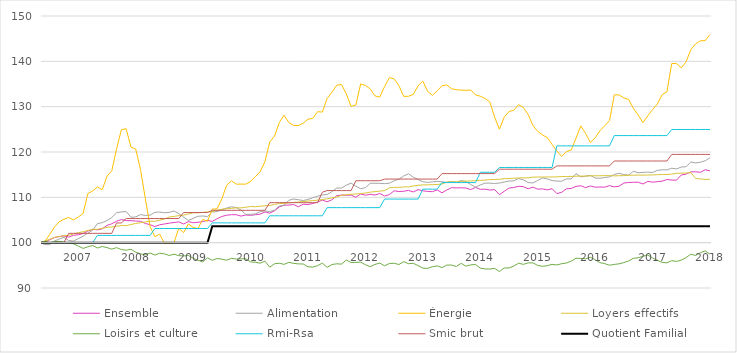
| Category | Ensemble | Alimentation | Énergie | Loyers effectifs  | Loisirs et culture | Rmi-Rsa | Smic brut | Quotient Familial |
|---|---|---|---|---|---|---|---|---|
| 2018.0 | 115.839 | 118.732 | 145.919 | 113.98 | 97.485 | 124.967 | 119.469 | 103.636 |
| 2018.0 | 116.085 | 118.072 | 144.578 | 113.957 | 98.178 | 124.967 | 119.469 | 103.636 |
| 2018.0 | 115.526 | 117.743 | 144.54 | 114.072 | 97.789 | 124.967 | 119.469 | 103.636 |
| 2018.0 | 115.626 | 117.595 | 143.844 | 114.14 | 97.172 | 124.967 | 119.469 | 103.636 |
| 2018.0 | 115.615 | 117.799 | 142.617 | 115.455 | 97.456 | 124.967 | 119.469 | 103.636 |
| 2018.0 | 115.123 | 116.754 | 139.871 | 115.364 | 96.707 | 124.967 | 119.469 | 103.636 |
| 2018.0 | 114.933 | 116.686 | 138.555 | 115.318 | 96.156 | 124.967 | 119.469 | 103.636 |
| 2018.0 | 113.781 | 116.265 | 139.529 | 115.295 | 95.862 | 124.967 | 119.469 | 103.636 |
| 2018.0 | 113.814 | 116.424 | 139.517 | 115.123 | 96.033 | 124.967 | 119.469 | 103.636 |
| 2017.0 | 113.926 | 116.049 | 133.279 | 115.043 | 95.549 | 123.622 | 118.018 | 103.636 |
| 2017.0 | 113.568 | 116.072 | 132.646 | 115.032 | 95.644 | 123.622 | 118.018 | 103.636 |
| 2017.0 | 113.456 | 115.958 | 130.609 | 114.998 | 96.118 | 123.622 | 118.018 | 103.636 |
| 2017.0 | 113.345 | 115.481 | 129.356 | 114.941 | 96.621 | 123.622 | 118.018 | 103.636 |
| 2017.0 | 113.523 | 115.56 | 127.989 | 114.929 | 97.257 | 123.622 | 118.018 | 103.636 |
| 2017.0 | 112.942 | 115.504 | 126.471 | 114.895 | 97.02 | 123.622 | 118.018 | 103.636 |
| 2017.0 | 113.333 | 115.424 | 128.141 | 114.906 | 96.669 | 123.622 | 118.018 | 103.636 |
| 2017.0 | 113.322 | 115.754 | 129.596 | 114.883 | 96.555 | 123.622 | 118.018 | 103.636 |
| 2017.0 | 113.266 | 114.924 | 131.583 | 114.861 | 95.966 | 123.622 | 118.018 | 103.636 |
| 2017.0 | 113.166 | 114.992 | 131.937 | 114.792 | 95.606 | 123.622 | 118.018 | 103.636 |
| 2017.0 | 112.45 | 115.322 | 132.595 | 114.769 | 95.33 | 123.622 | 118.018 | 103.636 |
| 2017.0 | 112.315 | 115.026 | 132.608 | 114.735 | 95.207 | 123.622 | 118.018 | 103.636 |
| 2016.0 | 112.584 | 114.515 | 126.914 | 114.792 | 95.027 | 121.354 | 116.929 | 103.636 |
| 2016.0 | 112.248 | 114.367 | 125.8 | 114.792 | 95.378 | 121.354 | 116.929 | 103.636 |
| 2016.0 | 112.271 | 114.196 | 124.674 | 114.758 | 95.596 | 121.354 | 116.929 | 103.636 |
| 2016.0 | 112.237 | 114.265 | 123.13 | 114.758 | 96.222 | 121.354 | 116.929 | 103.636 |
| 2016.0 | 112.506 | 114.844 | 122.106 | 114.735 | 96.792 | 121.354 | 116.929 | 103.636 |
| 2016.0 | 112.136 | 114.651 | 124.092 | 114.701 | 96.431 | 121.354 | 116.929 | 103.636 |
| 2016.0 | 112.562 | 114.526 | 125.762 | 114.678 | 96.517 | 121.354 | 116.929 | 103.636 |
| 2016.0 | 112.416 | 115.242 | 123.042 | 114.666 | 96.564 | 121.354 | 116.929 | 103.636 |
| 2016.0 | 111.957 | 114.071 | 120.435 | 114.609 | 95.928 | 121.354 | 116.929 | 103.636 |
| 2016.0 | 111.879 | 114.071 | 120.068 | 114.598 | 95.511 | 121.354 | 116.929 | 103.636 |
| 2016.0 | 111.107 | 113.549 | 119.018 | 114.598 | 95.359 | 121.354 | 116.929 | 103.636 |
| 2016.0 | 110.828 | 113.583 | 120.233 | 114.506 | 95.084 | 121.354 | 116.929 | 103.636 |
| 2015.0 | 111.902 | 113.696 | 121.663 | 114.495 | 95.207 | 116.59 | 116.204 | 103.636 |
| 2015.0 | 111.655 | 114.049 | 123.181 | 114.483 | 94.922 | 116.59 | 116.204 | 103.636 |
| 2015.0 | 111.868 | 114.287 | 123.763 | 114.483 | 94.789 | 116.59 | 116.204 | 103.636 |
| 2015.0 | 111.801 | 113.73 | 124.548 | 114.483 | 94.979 | 116.59 | 116.204 | 103.636 |
| 2015.0 | 112.248 | 113.162 | 125.864 | 114.449 | 95.549 | 116.59 | 116.204 | 103.636 |
| 2015.0 | 111.89 | 113.264 | 128.268 | 114.312 | 95.539 | 116.59 | 116.204 | 103.636 |
| 2015.0 | 112.349 | 113.867 | 129.824 | 114.3 | 95.216 | 116.59 | 116.204 | 103.636 |
| 2015.0 | 112.438 | 114.14 | 130.444 | 114.278 | 95.463 | 116.59 | 116.204 | 103.636 |
| 2015.0 | 112.17 | 113.628 | 129.204 | 114.209 | 94.837 | 116.59 | 116.204 | 103.636 |
| 2015.0 | 112.047 | 113.605 | 128.951 | 114.14 | 94.419 | 116.59 | 116.204 | 103.636 |
| 2015.0 | 111.32 | 113.367 | 127.686 | 114.118 | 94.41 | 116.59 | 116.204 | 103.636 |
| 2015.0 | 110.582 | 113.151 | 125.028 | 113.98 | 93.631 | 116.59 | 116.204 | 103.636 |
| 2014.0 | 111.7 | 113.048 | 127.673 | 113.957 | 94.324 | 115.524 | 115.236 | 103.636 |
| 2014.0 | 111.611 | 113.128 | 131.039 | 113.9 | 94.191 | 115.524 | 115.236 | 103.636 |
| 2014.0 | 111.801 | 113.139 | 131.798 | 113.809 | 94.201 | 115.524 | 115.236 | 103.636 |
| 2014.0 | 111.767 | 112.73 | 132.304 | 113.74 | 94.391 | 115.524 | 115.236 | 103.636 |
| 2014.0 | 112.192 | 112.241 | 132.595 | 113.683 | 95.197 | 113.258 | 115.236 | 103.636 |
| 2014.0 | 111.7 | 112.844 | 133.683 | 113.603 | 95.103 | 113.258 | 115.236 | 103.636 |
| 2014.0 | 112.058 | 113.458 | 133.595 | 113.569 | 94.818 | 113.258 | 115.236 | 103.636 |
| 2014.0 | 112.103 | 113.696 | 133.658 | 113.523 | 95.435 | 113.258 | 115.236 | 103.636 |
| 2014.0 | 112.081 | 113.321 | 133.734 | 113.42 | 94.751 | 113.258 | 115.236 | 103.636 |
| 2014.0 | 112.125 | 113.503 | 133.949 | 113.42 | 95.065 | 113.258 | 115.236 | 103.636 |
| 2014.0 | 111.622 | 113.287 | 134.797 | 113.363 | 95.055 | 113.258 | 115.236 | 103.636 |
| 2014.0 | 111.007 | 113.435 | 134.62 | 112.94 | 94.505 | 113.258 | 115.236 | 103.636 |
| 2013.0 | 111.633 | 113.526 | 133.494 | 112.837 | 94.875 | 111.804 | 114.027 | 103.636 |
| 2013.0 | 111.253 | 113.412 | 132.519 | 112.803 | 94.704 | 111.804 | 114.027 | 103.636 |
| 2013.0 | 111.298 | 113.31 | 133.354 | 112.757 | 94.324 | 111.804 | 114.027 | 103.636 |
| 2013.0 | 111.443 | 113.424 | 135.645 | 112.746 | 94.391 | 111.804 | 114.027 | 103.636 |
| 2013.0 | 111.7 | 113.946 | 134.594 | 112.654 | 94.951 | 109.613 | 114.027 | 103.636 |
| 2013.0 | 111.186 | 114.446 | 132.709 | 112.517 | 95.444 | 109.613 | 114.027 | 103.636 |
| 2013.0 | 111.521 | 115.208 | 132.292 | 112.311 | 95.368 | 109.613 | 114.027 | 103.636 |
| 2013.0 | 111.342 | 114.708 | 132.266 | 112.289 | 95.814 | 109.613 | 114.027 | 103.636 |
| 2013.0 | 111.275 | 114.003 | 134.632 | 112.209 | 95.178 | 109.613 | 114.027 | 103.636 |
| 2013.0 | 111.443 | 113.662 | 136.138 | 112.197 | 95.454 | 109.613 | 114.027 | 103.636 |
| 2013.0 | 110.604 | 113.117 | 136.404 | 112.106 | 95.406 | 109.613 | 114.027 | 103.636 |
| 2013.0 | 110.291 | 113.014 | 134.443 | 111.477 | 94.894 | 109.613 | 114.027 | 103.636 |
| 2012.0 | 110.85 | 113.083 | 132.102 | 111.363 | 95.492 | 107.729 | 113.664 | 103.636 |
| 2012.0 | 110.503 | 113.105 | 132.367 | 111.26 | 95.207 | 107.729 | 113.664 | 103.636 |
| 2012.0 | 110.671 | 113.094 | 133.936 | 111.145 | 94.704 | 107.729 | 113.664 | 103.636 |
| 2012.0 | 110.47 | 112.139 | 134.645 | 110.951 | 95.131 | 107.729 | 113.664 | 103.636 |
| 2012.0 | 110.738 | 111.9 | 135.037 | 110.837 | 95.7 | 107.729 | 113.664 | 103.636 |
| 2012.0 | 110.011 | 112.446 | 130.356 | 110.722 | 95.653 | 107.729 | 113.664 | 103.636 |
| 2012.0 | 110.492 | 113.139 | 130.052 | 110.688 | 95.615 | 107.729 | 111.488 | 103.636 |
| 2012.0 | 110.459 | 112.685 | 132.823 | 110.562 | 96.156 | 107.729 | 111.488 | 103.636 |
| 2012.0 | 110.515 | 112.048 | 134.898 | 110.448 | 95.273 | 107.729 | 111.488 | 103.636 |
| 2012.0 | 110.369 | 112.048 | 134.721 | 110.094 | 95.34 | 107.729 | 111.488 | 103.636 |
| 2012.0 | 109.463 | 111.264 | 133.19 | 109.888 | 95.178 | 107.729 | 111.488 | 103.636 |
| 2012.0 | 109.016 | 110.639 | 131.823 | 109.671 | 94.562 | 107.729 | 111.488 | 103.636 |
| 2011.0 | 109.396 | 110.536 | 128.799 | 109.488 | 95.482 | 105.928 | 111.125 | 103.636 |
| 2011.0 | 108.96 | 110.23 | 128.9 | 109.385 | 94.922 | 105.928 | 108.827 | 103.636 |
| 2011.0 | 108.658 | 109.923 | 127.407 | 109.271 | 94.609 | 105.928 | 108.827 | 103.636 |
| 2011.0 | 108.4 | 109.525 | 127.243 | 109.179 | 94.685 | 105.928 | 108.827 | 103.636 |
| 2011.0 | 108.479 | 109.298 | 126.344 | 109.076 | 95.292 | 105.928 | 108.827 | 103.636 |
| 2011.0 | 107.919 | 109.468 | 125.838 | 108.962 | 95.321 | 105.928 | 108.827 | 103.636 |
| 2011.0 | 108.4 | 109.627 | 125.851 | 108.882 | 95.425 | 105.928 | 108.827 | 103.636 |
| 2011.0 | 108.311 | 109.354 | 126.496 | 108.779 | 95.662 | 105.928 | 108.827 | 103.636 |
| 2011.0 | 108.255 | 108.263 | 128.103 | 108.665 | 95.216 | 105.928 | 108.827 | 103.636 |
| 2011.0 | 107.886 | 108.093 | 126.509 | 108.653 | 95.454 | 105.928 | 108.827 | 103.636 |
| 2011.0 | 107.013 | 107.183 | 123.51 | 108.425 | 95.349 | 105.928 | 108.827 | 103.636 |
| 2011.0 | 106.51 | 106.854 | 122.181 | 108.208 | 94.599 | 105.928 | 108.827 | 103.636 |
| 2010.0 | 106.767 | 107.013 | 117.867 | 108.139 | 95.919 | 104.363 | 107.135 | 103.636 |
| 2010.0 | 106.286 | 106.831 | 115.652 | 108.036 | 95.473 | 104.363 | 107.135 | 103.636 |
| 2010.0 | 106.163 | 106.354 | 114.551 | 107.922 | 95.681 | 104.363 | 107.135 | 103.636 |
| 2010.0 | 106.029 | 106.251 | 113.489 | 107.979 | 95.757 | 104.363 | 107.135 | 103.636 |
| 2010.0 | 106.107 | 106.229 | 112.906 | 107.819 | 96.441 | 104.363 | 107.135 | 103.636 |
| 2010.0 | 105.861 | 107.172 | 112.919 | 107.67 | 96.441 | 104.363 | 107.135 | 103.636 |
| 2010.0 | 106.163 | 107.752 | 112.906 | 107.682 | 96.393 | 104.363 | 107.135 | 103.636 |
| 2010.0 | 106.174 | 107.922 | 113.64 | 107.579 | 96.536 | 104.363 | 107.135 | 103.636 |
| 2010.0 | 106.051 | 107.638 | 112.666 | 107.487 | 96.128 | 104.363 | 107.135 | 103.636 |
| 2010.0 | 105.783 | 107.229 | 109.68 | 107.385 | 96.365 | 104.363 | 107.135 | 103.636 |
| 2010.0 | 105.268 | 106.854 | 107.44 | 107.11 | 96.507 | 104.363 | 107.135 | 103.636 |
| 2010.0 | 104.687 | 106.774 | 107.428 | 106.87 | 96.109 | 104.363 | 107.135 | 103.636 |
| 2009.0 | 104.922 | 105.763 | 104.732 | 106.802 | 96.65 | 103.124 | 106.651 | 100 |
| 2009.0 | 104.642 | 105.888 | 105.125 | 106.687 | 95.767 | 103.124 | 106.651 | 100 |
| 2009.0 | 104.497 | 105.82 | 103.125 | 106.584 | 96.118 | 103.124 | 106.651 | 100 |
| 2009.0 | 104.396 | 105.365 | 103.366 | 106.584 | 96.583 | 103.124 | 106.651 | 100 |
| 2009.0 | 104.653 | 104.887 | 104.138 | 106.333 | 97.172 | 103.124 | 106.651 | 100 |
| 2009.0 | 104.116 | 105.66 | 102.202 | 106.081 | 97.067 | 103.124 | 106.651 | 100 |
| 2009.0 | 104.586 | 106.399 | 103.189 | 105.956 | 97.143 | 103.124 | 105.321 | 100 |
| 2009.0 | 104.452 | 106.99 | 100.025 | 105.796 | 97.456 | 103.124 | 105.321 | 100 |
| 2009.0 | 104.295 | 106.672 | 99.836 | 105.647 | 97.172 | 103.124 | 105.321 | 100 |
| 2009.0 | 104.128 | 106.604 | 99.848 | 105.213 | 97.532 | 103.124 | 105.321 | 100 |
| 2009.0 | 103.937 | 106.752 | 101.885 | 104.95 | 97.675 | 103.124 | 105.321 | 100 |
| 2009.0 | 103.546 | 106.706 | 101.329 | 104.71 | 97.257 | 103.124 | 105.321 | 100 |
| 2008.0 | 103.971 | 106.058 | 103.581 | 104.744 | 97.732 | 101.599 | 105.321 | 100 |
| 2008.0 | 104.228 | 106.013 | 109.756 | 104.572 | 97.304 | 101.599 | 105.321 | 100 |
| 2008.0 | 104.72 | 106.195 | 116.133 | 104.401 | 97.523 | 101.599 | 105.321 | 100 |
| 2008.0 | 104.776 | 105.683 | 120.65 | 104.241 | 97.893 | 101.599 | 105.321 | 100 |
| 2008.0 | 104.843 | 105.604 | 121.068 | 104.001 | 98.557 | 101.599 | 105.321 | 100 |
| 2008.0 | 104.877 | 106.865 | 125.142 | 103.749 | 98.33 | 101.599 | 105.321 | 100 |
| 2008.0 | 105.101 | 106.786 | 124.915 | 103.795 | 98.491 | 101.599 | 104.353 | 100 |
| 2008.0 | 104.72 | 106.581 | 120.676 | 103.624 | 98.899 | 101.599 | 104.353 | 100 |
| 2008.0 | 104.161 | 105.558 | 115.867 | 103.452 | 98.567 | 101.599 | 102.056 | 100 |
| 2008.0 | 103.814 | 104.865 | 114.665 | 103.384 | 98.918 | 101.599 | 102.056 | 100 |
| 2008.0 | 103.043 | 104.41 | 111.666 | 103.166 | 99.155 | 101.599 | 102.056 | 100 |
| 2008.0 | 102.819 | 104.206 | 112.299 | 102.949 | 98.823 | 101.599 | 102.056 | 100 |
| 2007.0 | 102.942 | 102.739 | 111.401 | 102.938 | 99.374 | 100 | 102.056 | 100 |
| 2007.0 | 102.562 | 102.103 | 110.831 | 102.675 | 99.098 | 100 | 102.056 | 100 |
| 2007.0 | 102.002 | 101.421 | 106.415 | 102.401 | 98.728 | 100 | 102.056 | 100 |
| 2007.0 | 101.745 | 100.898 | 105.669 | 102.218 | 99.25 | 100 | 102.056 | 100 |
| 2007.0 | 101.633 | 100.352 | 104.998 | 101.92 | 99.753 | 100 | 102.056 | 100 |
| 2007.0 | 101.219 | 100.477 | 105.568 | 101.612 | 99.924 | 100 | 102.056 | 100 |
| 2007.0 | 101.477 | 101.171 | 105.15 | 101.543 | 100.114 | 100 | 100 | 100 |
| 2007.0 | 101.353 | 100.807 | 104.606 | 101.349 | 100.294 | 100 | 100 | 100 |
| 2007.0 | 101.107 | 100.352 | 103.429 | 101.155 | 100.228 | 100 | 100 | 100 |
| 2007.0 | 100.615 | 99.545 | 101.771 | 100.709 | 100.009 | 100 | 100 | 100 |
| 2007.0 | 100.19 | 99.602 | 100.215 | 100.354 | 100.332 | 100 | 100 | 100 |
| 2007.0 | 100 | 100 | 100 | 100 | 100 | 100 | 100 | 100 |